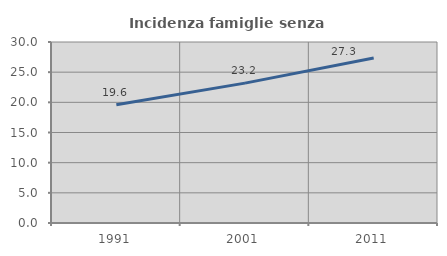
| Category | Incidenza famiglie senza nuclei |
|---|---|
| 1991.0 | 19.588 |
| 2001.0 | 23.187 |
| 2011.0 | 27.345 |